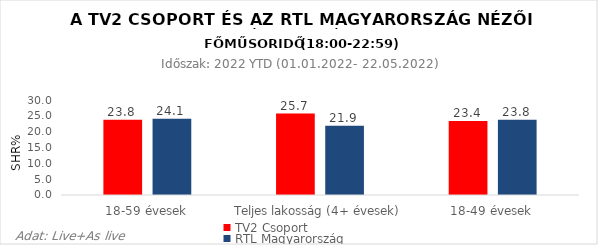
| Category | TV2 Csoport | RTL Magyarország |
|---|---|---|
| 18-59 évesek | 23.8 | 24.1 |
| Teljes lakosság (4+ évesek) | 25.7 | 21.9 |
| 18-49 évesek | 23.4 | 23.8 |